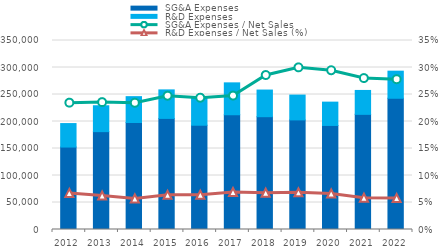
| Category |  SG&A Expenses |  R&D Expenses |
|---|---|---|
| 2012.0 | 152676 | 43488 |
| 2013.0 | 181225 | 47928 |
| 2014.0 | 198103 | 47913 |
| 2015.0 | 205735 | 52790 |
| 2016.0 | 193093 | 50539 |
| 2017.0 | 212481 | 59077 |
| 2018.0 | 208895 | 49335 |
| 2019.0 | 202954 | 45988 |
| 2020.0 | 192687 | 43184 |
| 2021.0 | 213234 | 44277 |
| 2022.0 | 243015 | 50182 |